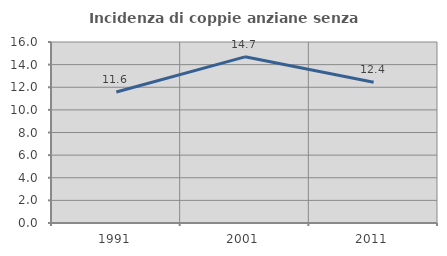
| Category | Incidenza di coppie anziane senza figli  |
|---|---|
| 1991.0 | 11.579 |
| 2001.0 | 14.689 |
| 2011.0 | 12.435 |